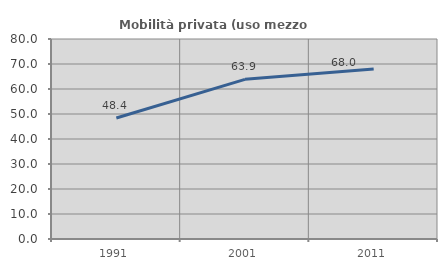
| Category | Mobilità privata (uso mezzo privato) |
|---|---|
| 1991.0 | 48.407 |
| 2001.0 | 63.875 |
| 2011.0 | 67.972 |